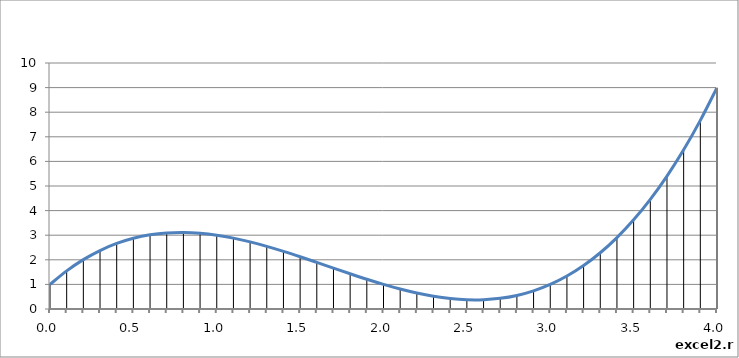
| Category | Series 0 |
|---|---|
| 0.0 | 1 |
| 0.1 | 1.551 |
| 0.2 | 2.008 |
| 0.30000000000000004 | 2.377 |
| 0.4 | 2.664 |
| 0.5 | 2.875 |
| 0.6000000000000001 | 3.016 |
| 0.7000000000000001 | 3.093 |
| 0.8 | 3.112 |
| 0.9 | 3.079 |
| 1.0 | 3 |
| 1.1 | 2.881 |
| 1.2000000000000002 | 2.728 |
| 1.3 | 2.547 |
| 1.4000000000000001 | 2.344 |
| 1.5 | 2.125 |
| 1.6 | 1.896 |
| 1.7000000000000002 | 1.663 |
| 1.8 | 1.432 |
| 1.9000000000000001 | 1.209 |
| 2.0 | 1 |
| 2.1 | 0.811 |
| 2.2 | 0.648 |
| 2.3000000000000003 | 0.517 |
| 2.4000000000000004 | 0.424 |
| 2.5 | 0.375 |
| 2.6 | 0.376 |
| 2.7 | 0.433 |
| 2.8000000000000003 | 0.552 |
| 2.9000000000000004 | 0.739 |
| 3.0 | 1 |
| 3.1 | 1.341 |
| 3.2 | 1.768 |
| 3.3000000000000003 | 2.287 |
| 3.4000000000000004 | 2.904 |
| 3.5 | 3.625 |
| 3.6 | 4.456 |
| 3.7 | 5.403 |
| 3.8000000000000003 | 6.472 |
| 3.9000000000000004 | 7.669 |
| 4.0 | 9 |